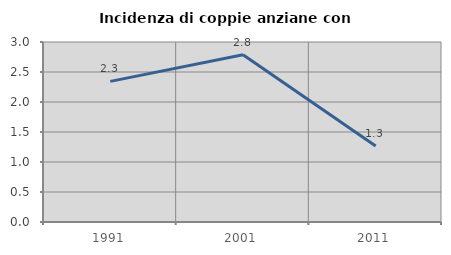
| Category | Incidenza di coppie anziane con figli |
|---|---|
| 1991.0 | 2.344 |
| 2001.0 | 2.787 |
| 2011.0 | 1.266 |